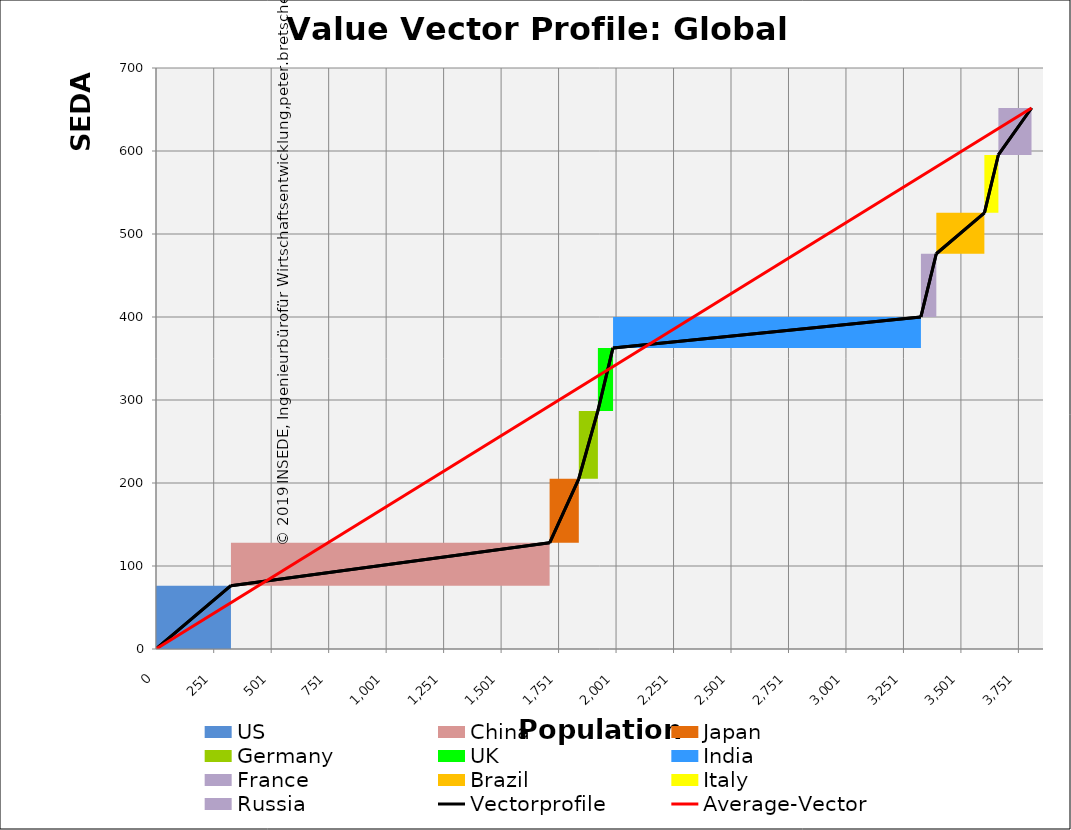
| Category | transparent | US | China | Japan | Germany | UK | India | France | Brazil | Italy | Russia | Border right & top |
|---|---|---|---|---|---|---|---|---|---|---|---|---|
| 0.0 | 0 | 76.3 | 0 | 0 | 0 | 0 | 0 | 0 | 0 | 0 | 0 | 0 |
| 325.7 | 0 | 76.3 | 0 | 0 | 0 | 0 | 0 | 0 | 0 | 0 | 0 | 0 |
| 325.7 | 76.3 | 0 | 51.6 | 0 | 0 | 0 | 0 | 0 | 0 | 0 | 0 | 0 |
| 1712.1000000000001 | 76.3 | 0 | 51.6 | 0 | 0 | 0 | 0 | 0 | 0 | 0 | 0 | 0 |
| 1712.1000000000001 | 127.9 | 0 | 0 | 77.2 | 0 | 0 | 0 | 0 | 0 | 0 | 0 | 0 |
| 1838.9 | 127.9 | 0 | 0 | 77.2 | 0 | 0 | 0 | 0 | 0 | 0 | 0 | 0 |
| 1838.9 | 205.1 | 0 | 0 | 0 | 81.5 | 0 | 0 | 0 | 0 | 0 | 0 | 0 |
| 1921.6000000000001 | 205.1 | 0 | 0 | 0 | 81.5 | 0 | 0 | 0 | 0 | 0 | 0 | 0 |
| 1921.6000000000001 | 286.6 | 0 | 0 | 0 | 0 | 76.1 | 0 | 0 | 0 | 0 | 0 | 0 |
| 1987.6000000000001 | 286.6 | 0 | 0 | 0 | 0 | 76.1 | 0 | 0 | 0 | 0 | 0 | 0 |
| 1987.6000000000001 | 362.7 | 0 | 0 | 0 | 0 | 0 | 37.4 | 0 | 0 | 0 | 0 | 0 |
| 3326.8 | 362.7 | 0 | 0 | 0 | 0 | 0 | 37.4 | 0 | 0 | 0 | 0 | 0 |
| 3326.8 | 400.1 | 0 | 0 | 0 | 0 | 0 | 0 | 76.1 | 0 | 0 | 0 | 0 |
| 3393.9 | 400.1 | 0 | 0 | 0 | 0 | 0 | 0 | 76.1 | 0 | 0 | 0 | 0 |
| 3393.9 | 476.2 | 0 | 0 | 0 | 0 | 0 | 0 | 0 | 49.3 | 0 | 0 | 0 |
| 3603.2000000000003 | 476.2 | 0 | 0 | 0 | 0 | 0 | 0 | 0 | 49.3 | 0 | 0 | 0 |
| 3603.2000000000003 | 525.5 | 0 | 0 | 0 | 0 | 0 | 0 | 0 | 0 | 69.7 | 0 | 0 |
| 3663.8 | 525.5 | 0 | 0 | 0 | 0 | 0 | 0 | 0 | 0 | 69.7 | 0 | 0 |
| 3663.8 | 595.2 | 0 | 0 | 0 | 0 | 0 | 0 | 0 | 0 | 0 | 56.6 | 0 |
| 3808.3 | 595.2 | 0 | 0 | 0 | 0 | 0 | 0 | 0 | 0 | 0 | 56.6 | 0 |
| 3808.3 | 651.8 | 0 | 0 | 0 | 0 | 0 | 0 | 0 | 0 | 0 | 0 | 0 |
| 3858.3 | 651.8 | 0 | 0 | 0 | 0 | 0 | 0 | 0 | 0 | 0 | 0 | 0 |
| 3858.3 | 651.8 | 0 | 0 | 0 | 0 | 0 | 0 | 0 | 0 | 0 | 0 | 0 |